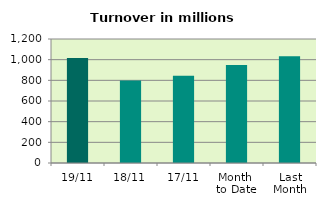
| Category | Series 0 |
|---|---|
| 19/11 | 1015.571 |
| 18/11 | 797.197 |
| 17/11 | 845.078 |
| Month 
to Date | 947.935 |
| Last
Month | 1032.218 |